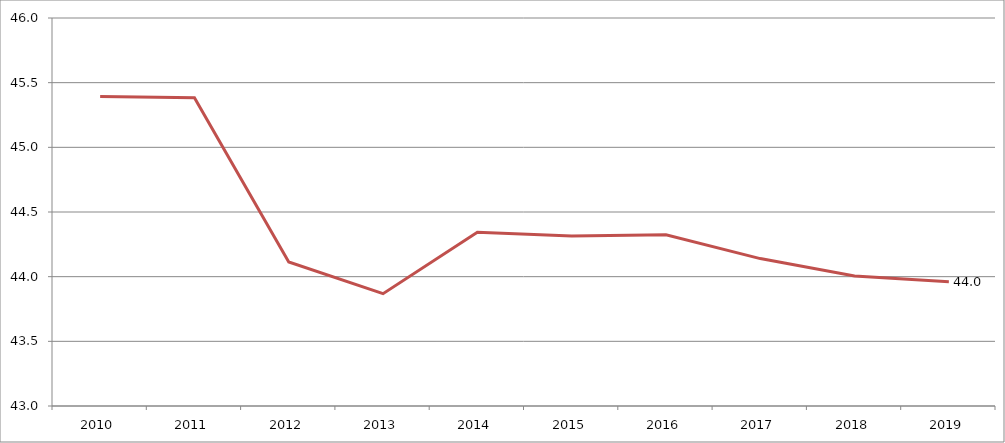
| Category | Part des spécialités de la production |
|---|---|
| 2010.0 | 45.393 |
| 2011.0 | 45.384 |
| 2012.0 | 44.114 |
| 2013.0 | 43.868 |
| 2014.0 | 44.344 |
| 2015.0 | 44.314 |
| 2016.0 | 44.324 |
| 2017.0 | 44.14 |
| 2018.0 | 44.005 |
| 2019.0 | 43.96 |